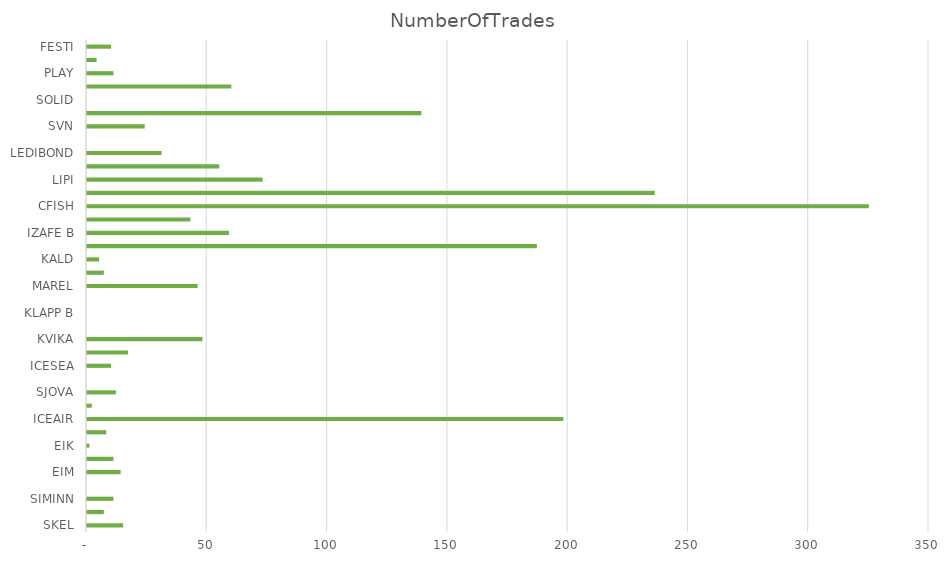
| Category | NumberOfTrades |
|---|---|
| SKEL | 15 |
| VIS | 7 |
| SIMINN | 11 |
| OSSRu | 0 |
| EIM | 14 |
| REITIR | 11 |
| EIK | 1 |
| REGINN | 8 |
| ICEAIR | 198 |
| HAGA | 2 |
| SJOVA | 12 |
| HEIMA | 0 |
| ICESEA | 10 |
| ORIGO | 17 |
| KVIKA | 48 |
| HAMP | 0 |
| KLAPP B | 0 |
| SFS B | 0 |
| MAREL | 46 |
| BRIM | 7 |
| KALD | 5 |
| STRAX | 187 |
| IZAFE B | 59 |
| ARION | 43 |
| CFISH | 325 |
| 2CUREX | 236 |
| LIPI | 73 |
| SCOUT | 55 |
| LEDIBOND | 31 |
| SIGN B | 0 |
| SVN | 24 |
| ACOU | 139 |
| SOLID | 0 |
| ISB | 60 |
| PLAY | 11 |
| SYN | 4 |
| FESTI | 10 |